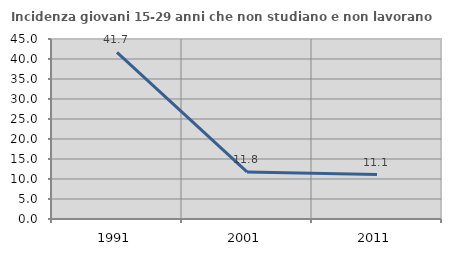
| Category | Incidenza giovani 15-29 anni che non studiano e non lavorano  |
|---|---|
| 1991.0 | 41.667 |
| 2001.0 | 11.765 |
| 2011.0 | 11.111 |